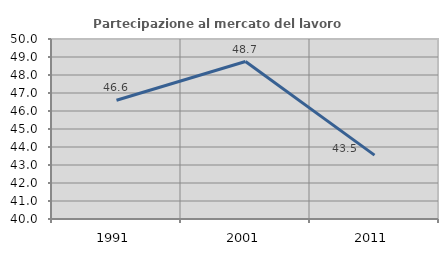
| Category | Partecipazione al mercato del lavoro  femminile |
|---|---|
| 1991.0 | 46.594 |
| 2001.0 | 48.747 |
| 2011.0 | 43.55 |